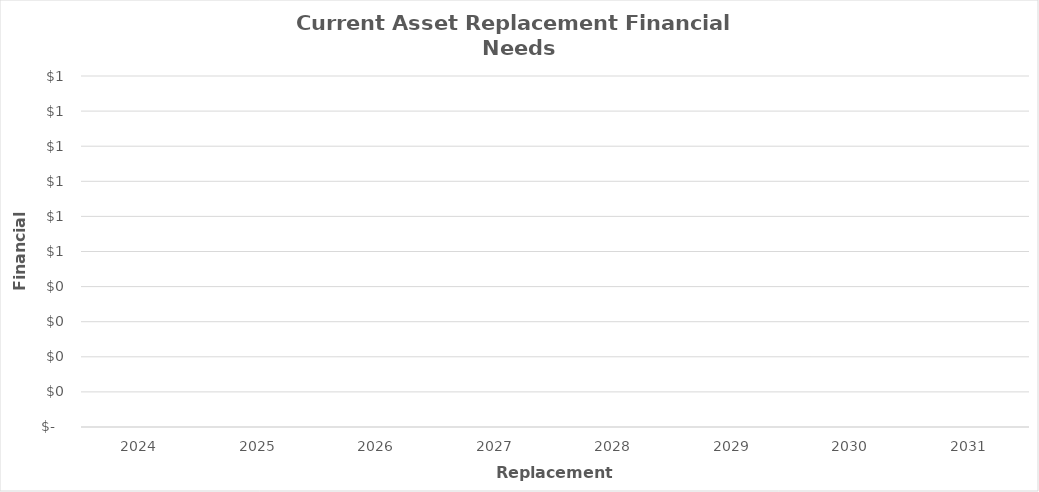
| Category | Total Financial 
Need |
|---|---|
| 2024.0 | 0 |
| 2025.0 | 0 |
| 2026.0 | 0 |
| 2027.0 | 0 |
| 2028.0 | 0 |
| 2029.0 | 0 |
| 2030.0 | 0 |
| 2031.0 | 0 |